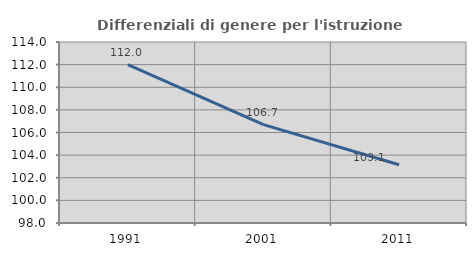
| Category | Differenziali di genere per l'istruzione superiore |
|---|---|
| 1991.0 | 111.999 |
| 2001.0 | 106.699 |
| 2011.0 | 103.146 |